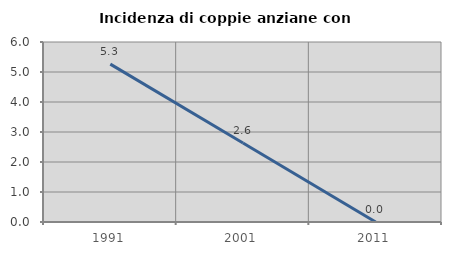
| Category | Incidenza di coppie anziane con figli |
|---|---|
| 1991.0 | 5.263 |
| 2001.0 | 2.632 |
| 2011.0 | 0 |